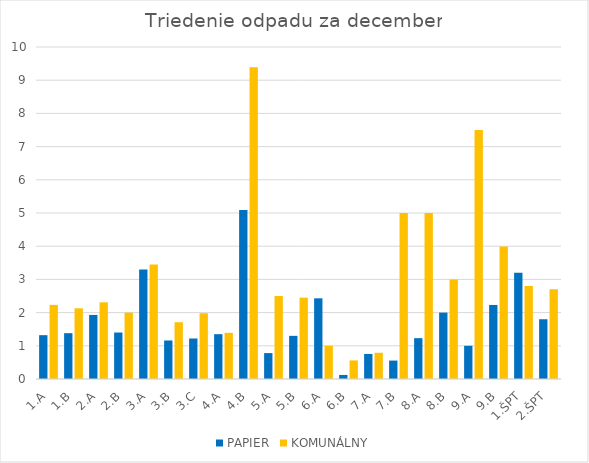
| Category | PAPIER | KOMUNÁLNY |
|---|---|---|
| 1.A | 1.32 | 2.233 |
| 1.B | 1.38 | 2.13 |
| 2.A | 1.93 | 2.31 |
| 2.B | 1.4 | 2 |
| 3.A | 3.3 | 3.45 |
| 3.B | 1.16 | 1.71 |
| 3.C | 1.22 | 1.981 |
| 4.A | 1.35 | 1.392 |
| 4.B | 5.09 | 9.39 |
| 5.A | 0.78 | 2.5 |
| 5.B | 1.3 | 2.45 |
| 6.A | 2.43 | 1 |
| 6.B | 0.122 | 0.56 |
| 7.A | 0.755 | 0.79 |
| 7.B | 0.555 | 5 |
| 8.A | 1.23 | 5 |
| 8.B | 2 | 3 |
| 9.A | 1 | 7.5 |
| 9.B | 2.23 | 3.99 |
| 1.ŠPT | 3.2 | 2.8 |
| 2.ŠPT | 1.8 | 2.7 |